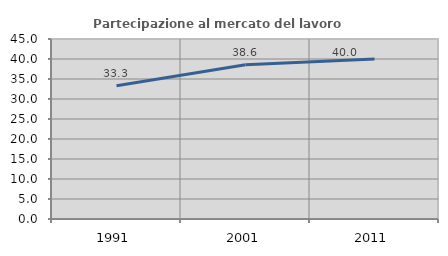
| Category | Partecipazione al mercato del lavoro  femminile |
|---|---|
| 1991.0 | 33.333 |
| 2001.0 | 38.554 |
| 2011.0 | 40 |